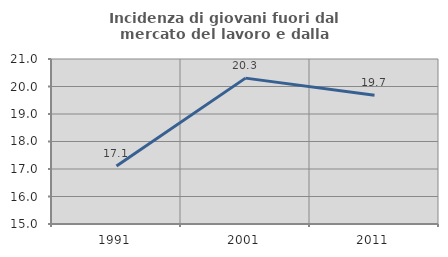
| Category | Incidenza di giovani fuori dal mercato del lavoro e dalla formazione  |
|---|---|
| 1991.0 | 17.105 |
| 2001.0 | 20.305 |
| 2011.0 | 19.681 |